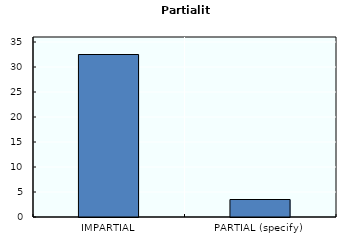
| Category | Partiality |
|---|---|
| IMPARTIAL | 32.5 |
| PARTIAL (specify) | 3.5 |